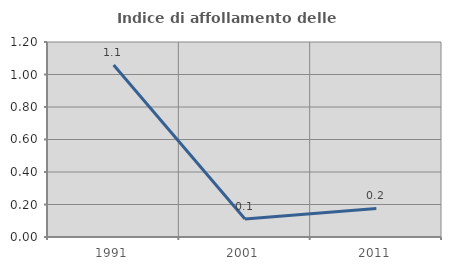
| Category | Indice di affollamento delle abitazioni  |
|---|---|
| 1991.0 | 1.059 |
| 2001.0 | 0.111 |
| 2011.0 | 0.176 |